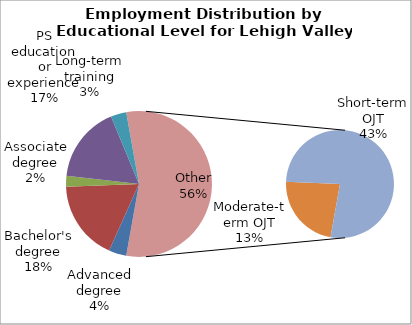
| Category | Series 0 |
|---|---|
| Advanced degree | 12960 |
| Bachelor's degree | 58700 |
| Associate degree | 8000 |
| PS education or experience | 56130 |
| Long-term training | 11430 |
| Moderate-term OJT | 42110 |
| Short-term OJT | 142350 |